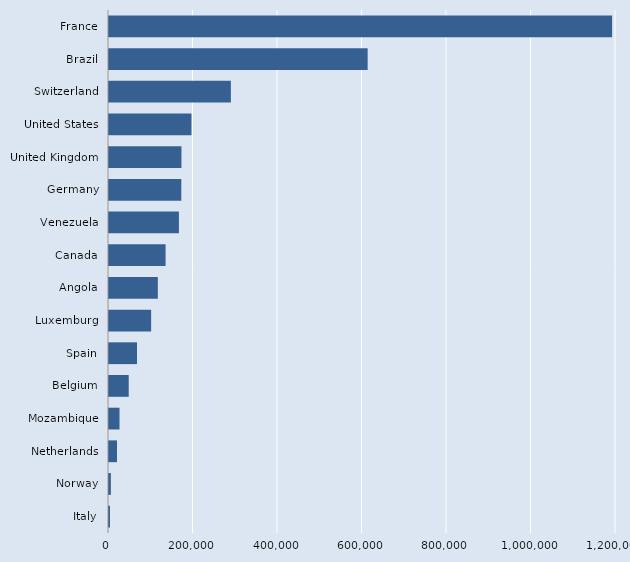
| Category | Series 0 |
|---|---|
| Italy | 2337 |
| Norway | 4400 |
| Netherlands | 18992 |
| Mozambique | 24871 |
| Belgium | 46642 |
| Spain | 66212 |
| Luxemburg | 99738 |
| Angola | 115595 |
| Canada | 133954 |
| Venezuela | 165498 |
| Germany | 171166 |
| United Kingdom | 171497 |
| United States | 195164 |
| Switzerland | 288465 |
| Brazil | 612203 |
| France | 1190798 |